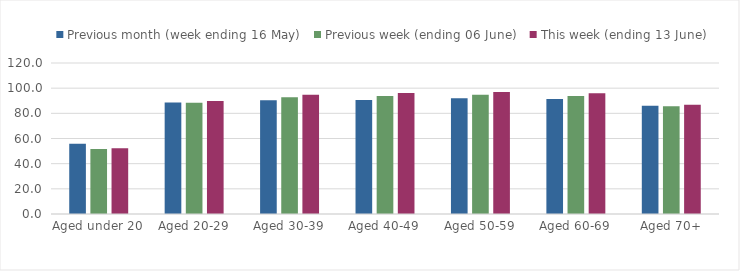
| Category | Previous month (week ending 16 May) | Previous week (ending 06 June) | This week (ending 13 June) |
|---|---|---|---|
| Aged under 20 | 55.862 | 51.684 | 52.294 |
| Aged 20-29 | 88.572 | 88.443 | 89.78 |
| Aged 30-39 | 90.307 | 92.839 | 94.701 |
| Aged 40-49 | 90.609 | 93.816 | 96.165 |
| Aged 50-59 | 91.942 | 94.746 | 96.87 |
| Aged 60-69 | 91.374 | 93.778 | 95.871 |
| Aged 70+ | 86.005 | 85.553 | 86.804 |